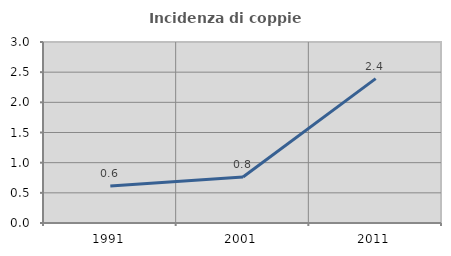
| Category | Incidenza di coppie miste |
|---|---|
| 1991.0 | 0.613 |
| 2001.0 | 0.761 |
| 2011.0 | 2.392 |